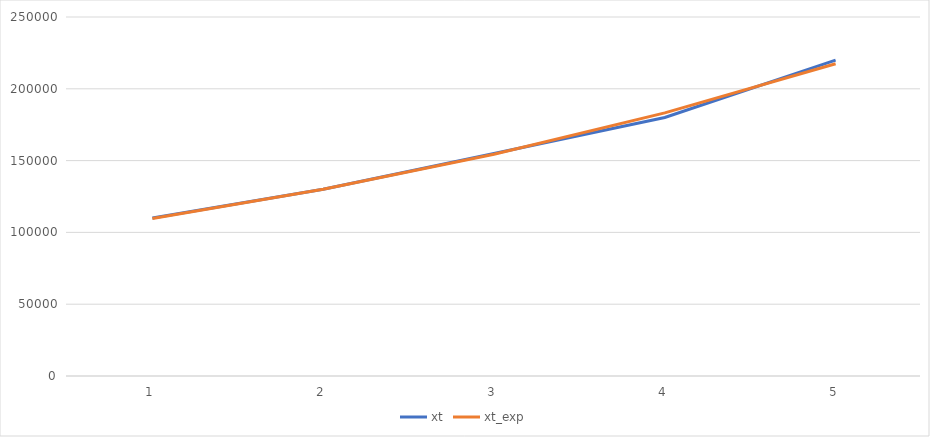
| Category | xt | xt_exp |
|---|---|---|
| 0 | 110000 | 109646.496 |
| 1 | 130000 | 130116.889 |
| 2 | 155000 | 154408.991 |
| 3 | 180000 | 183236.294 |
| 4 | 220000 | 217445.494 |